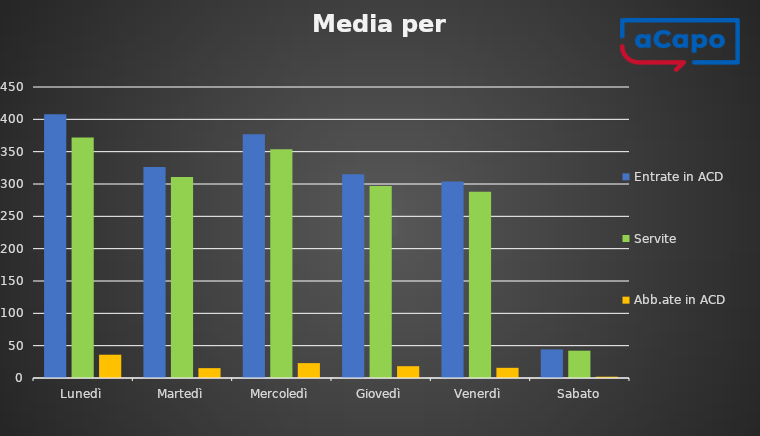
| Category | Entrate in ACD | Servite | Abb.ate in ACD |
|---|---|---|---|
| Lunedì | 407.75 | 371.75 | 36 |
| Martedì | 326.25 | 311 | 15.25 |
| Mercoledì | 376.75 | 353.75 | 23 |
| Giovedì | 315 | 296.75 | 18.25 |
| Venerdì | 303.75 | 288 | 15.75 |
| Sabato | 44.25 | 42.25 | 2 |